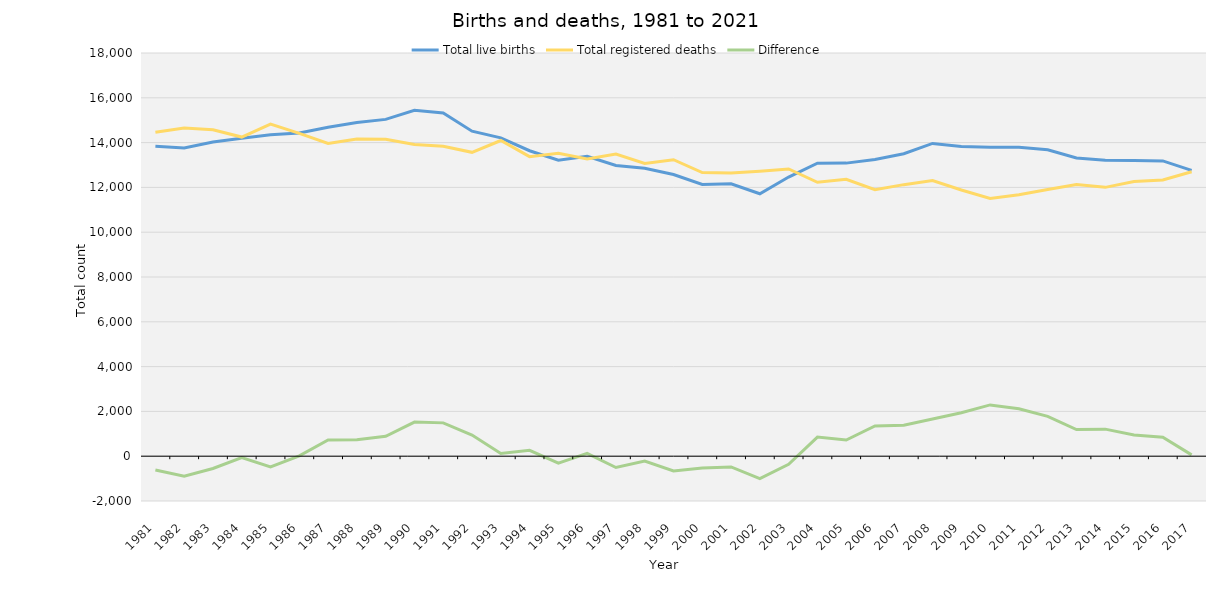
| Category | Total live births | Total registered deaths | Difference |
|---|---|---|---|
| 1981.0 | 13839 | 14458 | -619 |
| 1982.0 | 13759 | 14654 | -895 |
| 1983.0 | 14030 | 14577 | -547 |
| 1984.0 | 14191 | 14248 | -57 |
| 1985.0 | 14352 | 14826 | -474 |
| 1986.0 | 14425 | 14409 | 16 |
| 1987.0 | 14688 | 13961 | 727 |
| 1988.0 | 14899 | 14165 | 734 |
| 1989.0 | 15037 | 14147 | 890 |
| 1990.0 | 15442 | 13917 | 1525 |
| 1991.0 | 15324 | 13836 | 1488 |
| 1992.0 | 14510 | 13566 | 944 |
| 1993.0 | 14213 | 14094 | 119 |
| 1994.0 | 13637 | 13373 | 264 |
| 1995.0 | 13215 | 13521 | -306 |
| 1996.0 | 13391 | 13265 | 126 |
| 1997.0 | 12980 | 13486 | -506 |
| 1998.0 | 12856 | 13072 | -216 |
| 1999.0 | 12577 | 13235 | -658 |
| 2000.0 | 12132 | 12664 | -532 |
| 2001.0 | 12164 | 12645 | -481 |
| 2002.0 | 11716 | 12721 | -1005 |
| 2003.0 | 12463 | 12823 | -360 |
| 2004.0 | 13082 | 12230 | 852 |
| 2005.0 | 13084 | 12364 | 720 |
| 2006.0 | 13249 | 11898 | 1351 |
| 2007.0 | 13503 | 12123 | 1380 |
| 2008.0 | 13963 | 12306 | 1657 |
| 2009.0 | 13829 | 11886 | 1943 |
| 2010.0 | 13797 | 11508 | 2289 |
| 2011.0 | 13794 | 11676 | 2118 |
| 2012.0 | 13681 | 11903 | 1778 |
| 2013.0 | 13317 | 12125 | 1192 |
| 2014.0 | 13210 | 12002 | 1208 |
| 2015.0 | 13202 | 12259 | 943 |
| 2016.0 | 13183 | 12333 | 850 |
| 2017.0 | 12757 | 12697 | 60 |